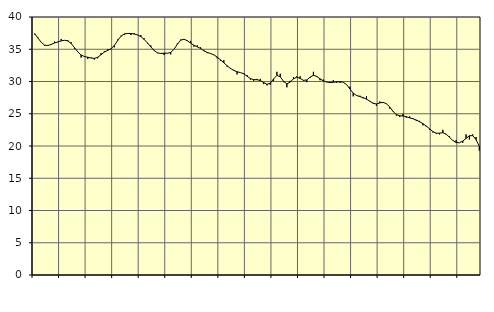
| Category | Piggar | Series 1 |
|---|---|---|
| nan | 37.3 | 37.42 |
| 87.0 | 36.8 | 36.73 |
| 87.0 | 36.1 | 36.07 |
| 87.0 | 35.5 | 35.63 |
| nan | 35.6 | 35.58 |
| 88.0 | 35.7 | 35.75 |
| 88.0 | 36.2 | 35.97 |
| 88.0 | 36.1 | 36.14 |
| nan | 36.6 | 36.3 |
| 89.0 | 36.4 | 36.39 |
| 89.0 | 36.4 | 36.29 |
| 89.0 | 36.1 | 35.9 |
| nan | 35.1 | 35.26 |
| 90.0 | 34.6 | 34.59 |
| 90.0 | 33.7 | 34.11 |
| 90.0 | 33.8 | 33.87 |
| nan | 33.5 | 33.76 |
| 91.0 | 33.7 | 33.64 |
| 91.0 | 33.4 | 33.59 |
| 91.0 | 33.6 | 33.76 |
| nan | 34.4 | 34.15 |
| 92.0 | 34.7 | 34.56 |
| 92.0 | 35 | 34.82 |
| 92.0 | 35 | 35.07 |
| nan | 35.3 | 35.58 |
| 93.0 | 36.5 | 36.34 |
| 93.0 | 37.1 | 37.02 |
| 93.0 | 37.2 | 37.37 |
| nan | 37.5 | 37.45 |
| 94.0 | 37.2 | 37.44 |
| 94.0 | 37.5 | 37.36 |
| 94.0 | 37.2 | 37.22 |
| nan | 37.2 | 36.96 |
| 95.0 | 36.7 | 36.52 |
| 95.0 | 35.9 | 35.98 |
| 95.0 | 35.6 | 35.36 |
| nan | 34.9 | 34.81 |
| 96.0 | 34.4 | 34.44 |
| 96.0 | 34.4 | 34.35 |
| 96.0 | 34.1 | 34.39 |
| nan | 34.4 | 34.38 |
| 97.0 | 34.2 | 34.51 |
| 97.0 | 35 | 35 |
| 97.0 | 35.9 | 35.78 |
| nan | 36.5 | 36.41 |
| 98.0 | 36.5 | 36.55 |
| 98.0 | 36.4 | 36.33 |
| 98.0 | 36.3 | 35.96 |
| nan | 35.4 | 35.62 |
| 99.0 | 35.6 | 35.38 |
| 99.0 | 35.3 | 35.12 |
| 99.0 | 34.7 | 34.78 |
| nan | 34.4 | 34.5 |
| 0.0 | 34.3 | 34.35 |
| 0.0 | 34.1 | 34.13 |
| 0.0 | 33.6 | 33.78 |
| nan | 33.2 | 33.36 |
| 1.0 | 33.3 | 32.9 |
| 1.0 | 32.3 | 32.44 |
| 1.0 | 32.1 | 32.03 |
| nan | 31.8 | 31.72 |
| 2.0 | 31.1 | 31.51 |
| 2.0 | 31.4 | 31.38 |
| 2.0 | 31.3 | 31.2 |
| nan | 31 | 30.83 |
| 3.0 | 30.3 | 30.45 |
| 3.0 | 30.1 | 30.29 |
| 3.0 | 30.4 | 30.28 |
| nan | 30.4 | 30.15 |
| 4.0 | 29.6 | 29.84 |
| 4.0 | 29.4 | 29.57 |
| 4.0 | 29.5 | 29.74 |
| nan | 30.1 | 30.4 |
| 5.0 | 31.5 | 30.94 |
| 5.0 | 31.2 | 30.74 |
| 5.0 | 29.9 | 30.02 |
| nan | 29.1 | 29.63 |
| 6.0 | 30.1 | 29.9 |
| 6.0 | 30.7 | 30.43 |
| 6.0 | 30.8 | 30.67 |
| nan | 30.8 | 30.48 |
| 7.0 | 30.1 | 30.18 |
| 7.0 | 29.9 | 30.24 |
| 7.0 | 30.6 | 30.68 |
| nan | 31.5 | 30.96 |
| 8.0 | 30.7 | 30.79 |
| 8.0 | 30.2 | 30.41 |
| 8.0 | 30.3 | 30.1 |
| nan | 29.9 | 29.92 |
| 9.0 | 29.9 | 29.84 |
| 9.0 | 30.2 | 29.88 |
| 9.0 | 29.8 | 29.95 |
| nan | 29.8 | 29.96 |
| 10.0 | 29.9 | 29.88 |
| 10.0 | 29.5 | 29.52 |
| 10.0 | 29.2 | 28.83 |
| nan | 27.7 | 28.2 |
| 11.0 | 27.9 | 27.83 |
| 11.0 | 27.8 | 27.66 |
| 11.0 | 27.4 | 27.5 |
| nan | 27.7 | 27.26 |
| 12.0 | 26.9 | 26.95 |
| 12.0 | 26.7 | 26.61 |
| 12.0 | 26.2 | 26.52 |
| nan | 26.9 | 26.68 |
| 13.0 | 26.7 | 26.77 |
| 13.0 | 26.6 | 26.56 |
| 13.0 | 25.8 | 26.03 |
| nan | 25.3 | 25.36 |
| 14.0 | 24.7 | 24.86 |
| 14.0 | 24.5 | 24.69 |
| 14.0 | 25 | 24.64 |
| nan | 24.4 | 24.54 |
| 15.0 | 24.6 | 24.36 |
| 15.0 | 24.3 | 24.22 |
| 15.0 | 23.9 | 24.03 |
| nan | 23.9 | 23.76 |
| 16.0 | 23.2 | 23.47 |
| 16.0 | 23 | 23.1 |
| 16.0 | 22.5 | 22.67 |
| nan | 22.1 | 22.23 |
| 17.0 | 21.9 | 21.98 |
| 17.0 | 21.8 | 21.99 |
| 17.0 | 22.5 | 22.06 |
| nan | 21.8 | 21.85 |
| 18.0 | 21.5 | 21.36 |
| 18.0 | 20.9 | 20.86 |
| 18.0 | 20.9 | 20.54 |
| nan | 20.5 | 20.5 |
| 19.0 | 20.5 | 20.76 |
| 19.0 | 21.8 | 21.18 |
| 19.0 | 21 | 21.59 |
| nan | 21.8 | 21.61 |
| 20.0 | 21.4 | 20.99 |
| 20.0 | 19.3 | 19.96 |